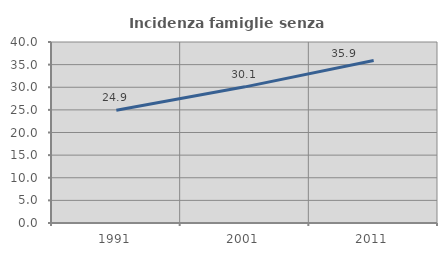
| Category | Incidenza famiglie senza nuclei |
|---|---|
| 1991.0 | 24.931 |
| 2001.0 | 30.088 |
| 2011.0 | 35.928 |